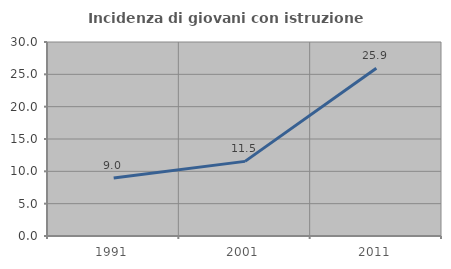
| Category | Incidenza di giovani con istruzione universitaria |
|---|---|
| 1991.0 | 8.955 |
| 2001.0 | 11.538 |
| 2011.0 | 25.926 |